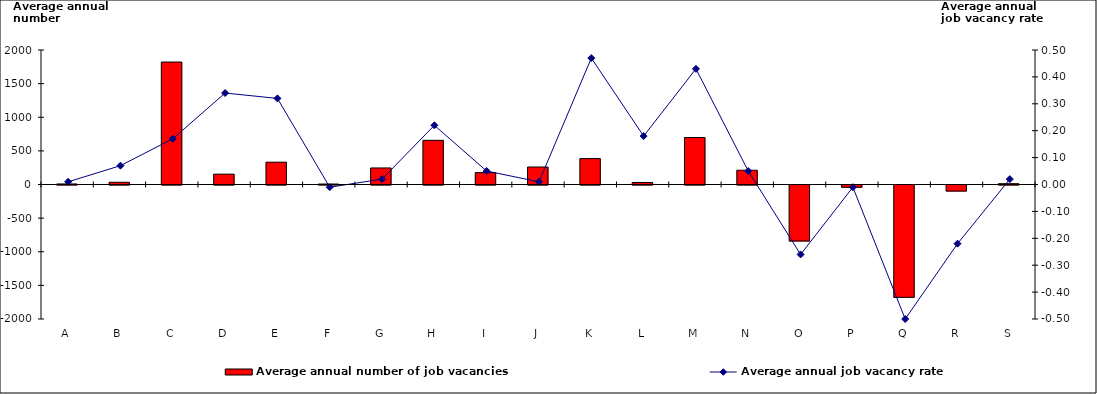
| Category | Average annual number of job vacancies |
|---|---|
| A | 8 |
| B | 33 |
| C | 1821 |
| D | 154 |
| E | 332 |
| F | 7 |
| G | 246 |
| H | 657 |
| I | 177 |
| J | 260 |
| K | 385 |
| L | 30 |
| M | 699 |
| N | 212 |
| O | -833 |
| P | -33 |
| Q | -1670 |
| R | -90 |
| S | 12 |